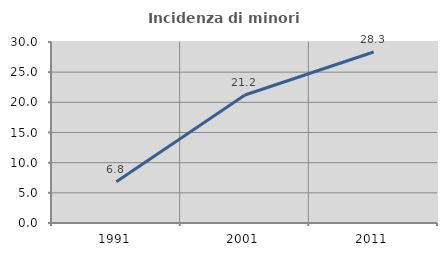
| Category | Incidenza di minori stranieri |
|---|---|
| 1991.0 | 6.818 |
| 2001.0 | 21.212 |
| 2011.0 | 28.347 |